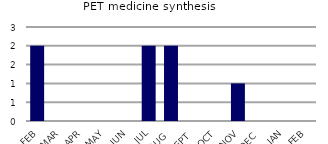
| Category | PET medicine synthesis |
|---|---|
| FEB | 2 |
| MAR | 0 |
| APR | 0 |
| MAY | 0 |
| JUN | 0 |
| JUL | 2 |
| AUG | 2 |
| SEPT | 0 |
| OCT | 0 |
| NOV | 1 |
| DEC | 0 |
| JAN | 0 |
| FEB | 0 |